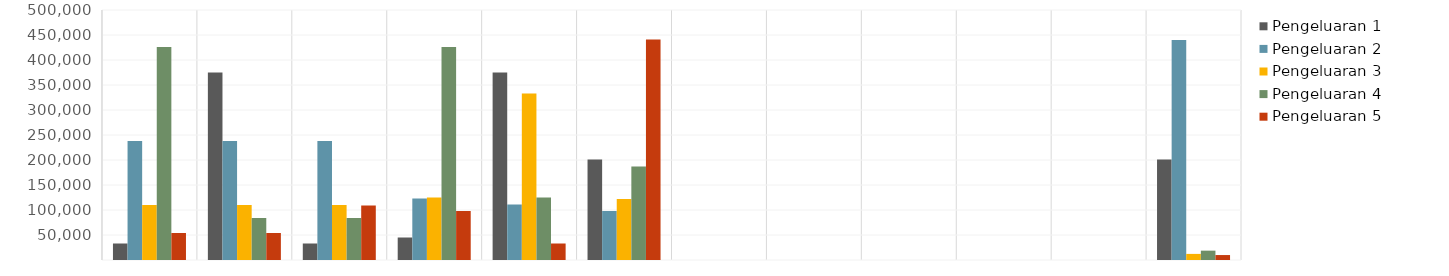
| Category | Pengeluaran 1 | Pengeluaran 2 | Pengeluaran 3 | Pengeluaran 4 | Pengeluaran 5 |
|---|---|---|---|---|---|
| Jan | 33000 | 238000 | 110000 | 426000 | 54000 |
| Feb | 375000 | 238000 | 110000 | 84000 | 54000 |
| Mar | 33000 | 238000 | 110000 | 84000 | 109000 |
| Apr | 45000 | 123000 | 125000 | 426000 | 98000 |
| Mei | 375000 | 111000 | 333000 | 125000 | 33000 |
| Jun | 201000 | 98000 | 122000 | 187000 | 441000 |
| Jul | 0 | 0 | 0 | 0 | 0 |
| Ags | 0 | 0 | 0 | 0 | 0 |
| Sep | 0 | 0 | 0 | 0 | 0 |
| Okt | 0 | 0 | 0 | 0 | 0 |
| Nov | 0 | 0 | 0 | 0 | 0 |
| Des | 201000 | 440000 | 12200 | 18700 | 9900 |